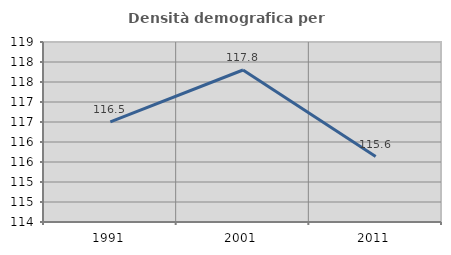
| Category | Densità demografica |
|---|---|
| 1991.0 | 116.501 |
| 2001.0 | 117.8 |
| 2011.0 | 115.635 |